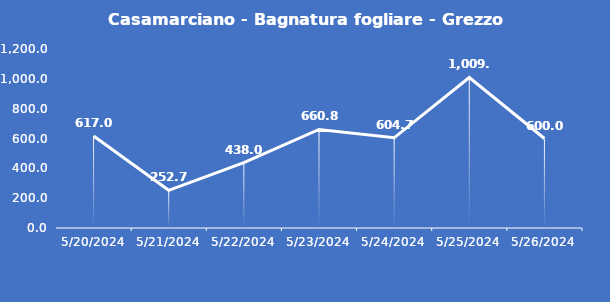
| Category | Casamarciano - Bagnatura fogliare - Grezzo (min) |
|---|---|
| 5/20/24 | 617 |
| 5/21/24 | 252.7 |
| 5/22/24 | 438 |
| 5/23/24 | 660.8 |
| 5/24/24 | 604.7 |
| 5/25/24 | 1009.2 |
| 5/26/24 | 600 |